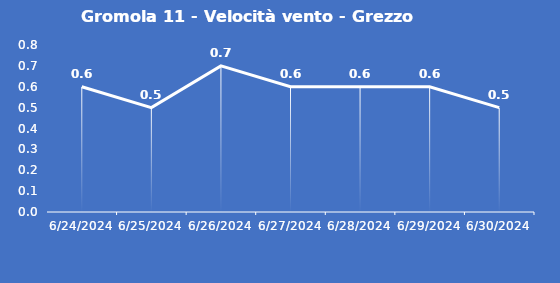
| Category | Gromola 11 - Velocità vento - Grezzo (m/s) |
|---|---|
| 6/24/24 | 0.6 |
| 6/25/24 | 0.5 |
| 6/26/24 | 0.7 |
| 6/27/24 | 0.6 |
| 6/28/24 | 0.6 |
| 6/29/24 | 0.6 |
| 6/30/24 | 0.5 |